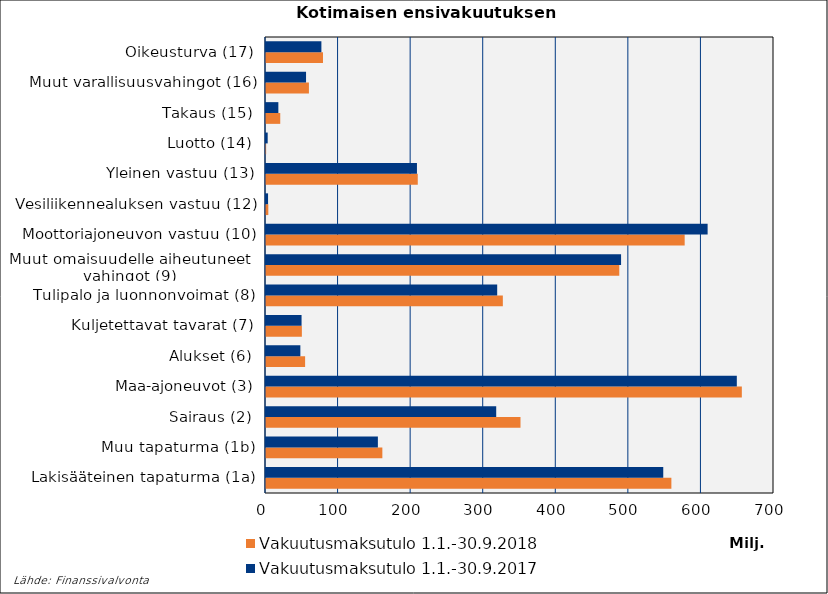
| Category | Vakuutusmaksutulo |
|---|---|
| Lakisääteinen tapaturma (1a) | 547402.07 |
| Muu tapaturma (1b) | 154166.375 |
| Sairaus (2) | 317214.574 |
| Maa-ajoneuvot (3) | 648767.502 |
| Alukset (6) | 47343.236 |
| Kuljetettavat tavarat (7) | 48993.336 |
| Tulipalo ja luonnonvoimat (8) | 318572.352 |
| Muut omaisuudelle aiheutuneet 
vahingot (9) | 489264.942 |
| Moottoriajoneuvon vastuu (10) | 608528.345 |
| Vesiliikennealuksen vastuu (12) | 2837.072 |
| Yleinen vastuu (13) | 208009.585 |
| Luotto (14) | 2320.877 |
| Takaus (15) | 17025.706 |
| Muut varallisuusvahingot (16) | 55174.175 |
| Oikeusturva (17) | 76330.184 |